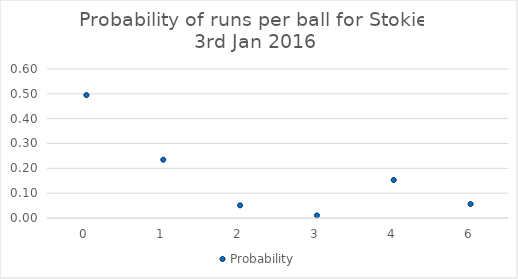
| Category | Probability |
|---|---|
| 0.0 | 0.495 |
| 1.0 | 0.235 |
| 2.0 | 0.051 |
| 3.0 | 0.01 |
| 4.0 | 0.153 |
| 6.0 | 0.056 |